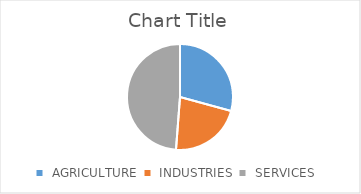
| Category | Series 0 |
|---|---|
|  AGRICULTURE  | 29.247 |
|  INDUSTRIES  | 21.966 |
|  SERVICES  | 48.787 |